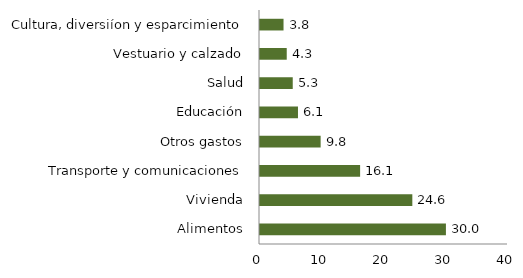
| Category | Series 0 |
|---|---|
| Alimentos | 29.988 |
| Vivienda | 24.569 |
| Transporte y comunicaciones | 16.148 |
| Otros gastos | 9.779 |
| Educación | 6.127 |
| Salud | 5.281 |
| Vestuario y calzado | 4.313 |
| Cultura, diversiíon y esparcimiento | 3.795 |